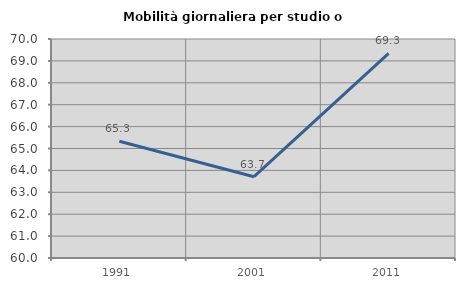
| Category | Mobilità giornaliera per studio o lavoro |
|---|---|
| 1991.0 | 65.332 |
| 2001.0 | 63.713 |
| 2011.0 | 69.348 |